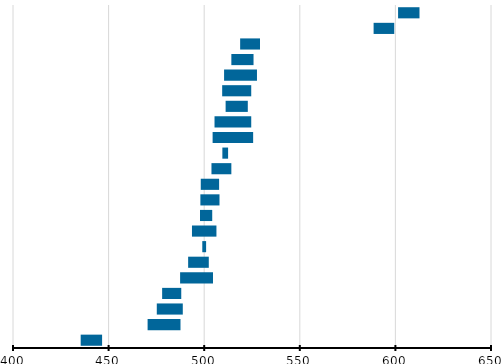
| Category | Series 0 | Series 1 |
|---|---|---|
| Corée du Sud | 601.4 | 11.2 |
| Japon | 588.6 | 10.8 |
| Irlande | 518.8 | 10.4 |
| Lituanie | 514.2 | 11.6 |
| Israël | 510.4 | 17.2 |
| Australie | 509.4 | 15.2 |
| Hongrie | 511.2 | 11.6 |
| États-Unis | 505.4 | 19.2 |
| Angleterre | 504.4 | 21.2 |
| Moyenne Internationale (UE et/ou OCDE) | 509.5 | 3 |
| Finlande | 503.8 | 10.4 |
| Norvège * | 498.2 | 9.6 |
| Suède | 498 | 10 |
| Chypre | 497.8 | 6.4 |
| Portugal | 493.6 | 12.8 |
| Centre de l'échelle TIMSS | 499 | 2 |
| Italie | 491.6 | 10.8 |
| Turquie | 487.4 | 17.2 |
| France | 478 | 10 |
| Nouvelle-Zélande | 475.2 | 13.6 |
| Roumanie | 470.4 | 17.2 |
| Chili | 435.4 | 11.2 |